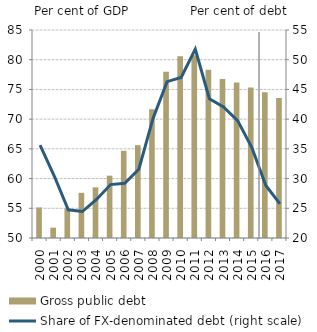
| Category | Gross public debt |
|---|---|
| 2000.0 | 55.142 |
| 2001.0 | 51.743 |
| 2002.0 | 54.994 |
| 2003.0 | 57.602 |
| 2004.0 | 58.519 |
| 2005.0 | 60.486 |
| 2006.0 | 64.674 |
| 2007.0 | 65.616 |
| 2008.0 | 71.647 |
| 2009.0 | 77.958 |
| 2010.0 | 80.582 |
| 2011.0 | 80.76 |
| 2012.0 | 78.294 |
| 2013.0 | 76.755 |
| 2014.0 | 76.179 |
| 2015.0 | 75.326 |
| 2016.0 | 74.534 |
| 2017.0 | 73.539 |